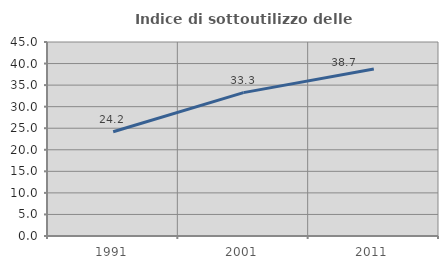
| Category | Indice di sottoutilizzo delle abitazioni  |
|---|---|
| 1991.0 | 24.185 |
| 2001.0 | 33.252 |
| 2011.0 | 38.728 |